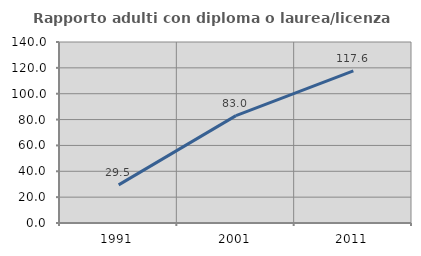
| Category | Rapporto adulti con diploma o laurea/licenza media  |
|---|---|
| 1991.0 | 29.466 |
| 2001.0 | 83.038 |
| 2011.0 | 117.634 |